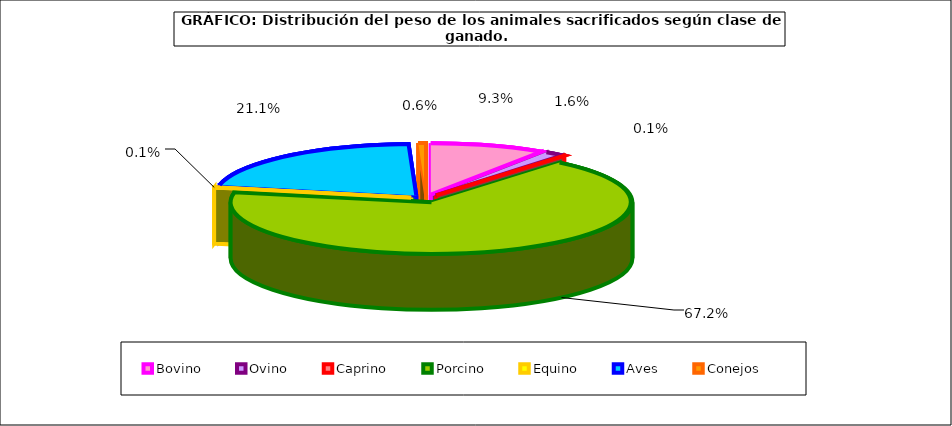
| Category | Series 0 |
|---|---|
| 0 | 717879.347 |
| 1 | 120385.899 |
| 2 | 10127.316 |
| 3 | 5180058.347 |
| 4 | 8498.358 |
| 5 | 1629453.774 |
| 6 | 47520.654 |